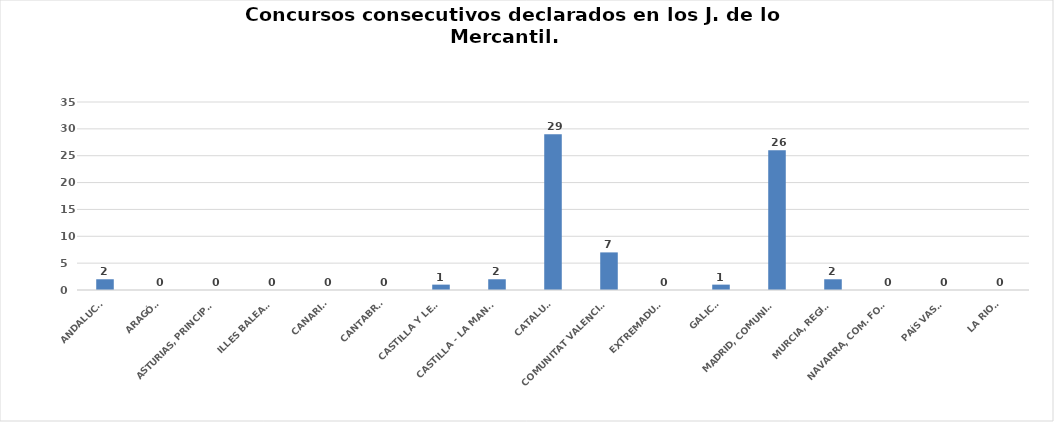
| Category | Series 0 |
|---|---|
| ANDALUCÍA | 2 |
| ARAGÓN | 0 |
| ASTURIAS, PRINCIPADO | 0 |
| ILLES BALEARS | 0 |
| CANARIAS | 0 |
| CANTABRIA | 0 |
| CASTILLA Y LEÓN | 1 |
| CASTILLA - LA MANCHA | 2 |
| CATALUÑA | 29 |
| COMUNITAT VALENCIANA | 7 |
| EXTREMADURA | 0 |
| GALICIA | 1 |
| MADRID, COMUNIDAD | 26 |
| MURCIA, REGIÓN | 2 |
| NAVARRA, COM. FORAL | 0 |
| PAÍS VASCO | 0 |
| LA RIOJA | 0 |